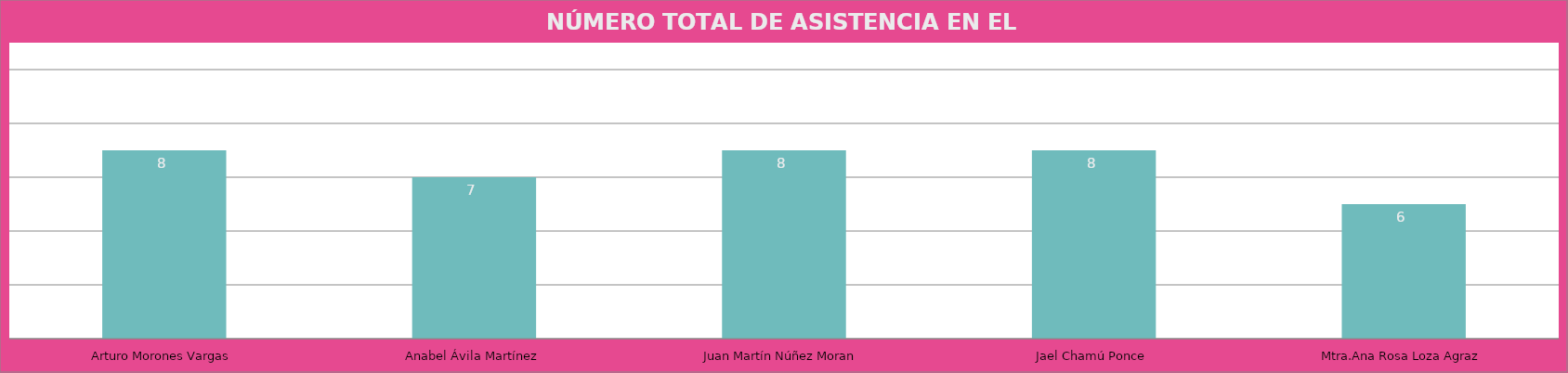
| Category | Arturo Morones Vargas |
|---|---|
| Arturo Morones Vargas | 8 |
| Anabel Ávila Martínez | 7 |
| Juan Martín Núñez Moran | 8 |
| Jael Chamú Ponce | 8 |
| Mtra.Ana Rosa Loza Agraz | 6 |